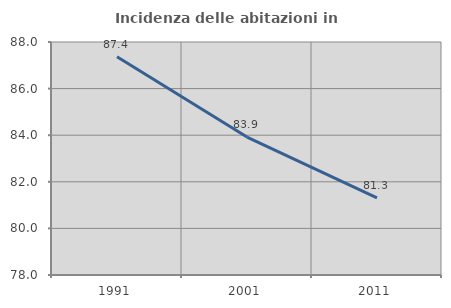
| Category | Incidenza delle abitazioni in proprietà  |
|---|---|
| 1991.0 | 87.369 |
| 2001.0 | 83.919 |
| 2011.0 | 81.314 |